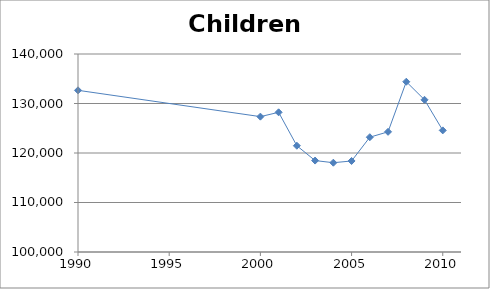
| Category | Series 0 |
|---|---|
| 1990.0 | 132663 |
| 2000.0 | 127346.511 |
| 2001.0 | 128219.517 |
| 2002.0 | 121469.697 |
| 2003.0 | 118471.053 |
| 2004.0 | 118036.989 |
| 2005.0 | 118388.011 |
| 2006.0 | 123191 |
| 2007.0 | 124278 |
| 2008.0 | 134400 |
| 2009.0 | 130748 |
| 2010.0 | 124570 |